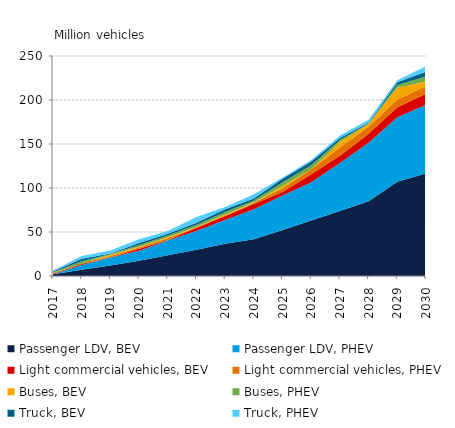
| Category | Passenger LDV, BEV | Passenger LDV, PHEV | Light commercial vehicles, BEV | Light commercial vehicles, PHEV | Buses, BEV | Buses, PHEV | Truck, BEV | Truck, PHEV |
|---|---|---|---|---|---|---|---|---|
| 2017.0 | 2.064 | 0.029 | 0.407 | 0.5 | 0.5 | 0.738 | 0.738 | 1.223 |
| 2018.0 | 7.136 | 5.291 | 1.221 | 0.763 | -0.607 | 2.894 | 2.894 | 3.048 |
| 2019.0 | 11.851 | 9.083 | 0.157 | 1.524 | 1.525 | 0.767 | 0.767 | 3.357 |
| 2020.0 | 17.301 | 11.382 | 2.289 | 1.526 | 0.616 | 2.138 | 2.138 | 4.27 |
| 2021.0 | 23.487 | 16.765 | 0.461 | 2.138 | 1.069 | 1.986 | 1.986 | 3.359 |
| 2022.0 | 29.857 | 21.2 | 3.667 | 0.464 | 0.764 | 2.292 | 2.292 | 6.407 |
| 2023.0 | 36.597 | 27.101 | 4.43 | 0.314 | 1.529 | 2.897 | 2.897 | 2.598 |
| 2024.0 | 41.882 | 33.851 | 5.958 | 1.534 | 0.459 | 2.139 | 2.139 | 5.038 |
| 2025.0 | 52.282 | 39.148 | 3.981 | 4.435 | 2.441 | 4.121 | 4.121 | 1.531 |
| 2026.0 | 63.057 | 43.467 | 9.016 | 5.657 | 0.157 | 4.427 | 4.427 | 1.532 |
| 2027.0 | 73.836 | 54.653 | 8.106 | 9.322 | 6.262 | 2.292 | 2.292 | 2.905 |
| 2028.0 | 84.807 | 66.573 | 10.243 | 8.103 | 2.906 | 0.918 | 0.918 | 3.059 |
| 2029.0 | 107.132 | 73.404 | 11.316 | 8.716 | 13.442 | 3.057 | 3.057 | 2.448 |
| 2030.0 | 116.651 | 77.929 | 12.541 | 8.869 | 5.045 | 5.613 | 5.613 | 6 |